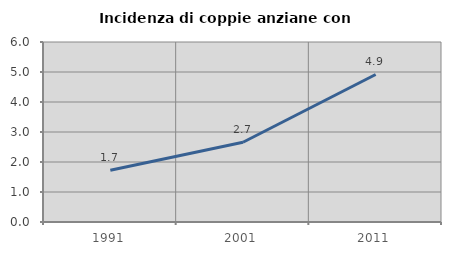
| Category | Incidenza di coppie anziane con figli |
|---|---|
| 1991.0 | 1.723 |
| 2001.0 | 2.66 |
| 2011.0 | 4.917 |